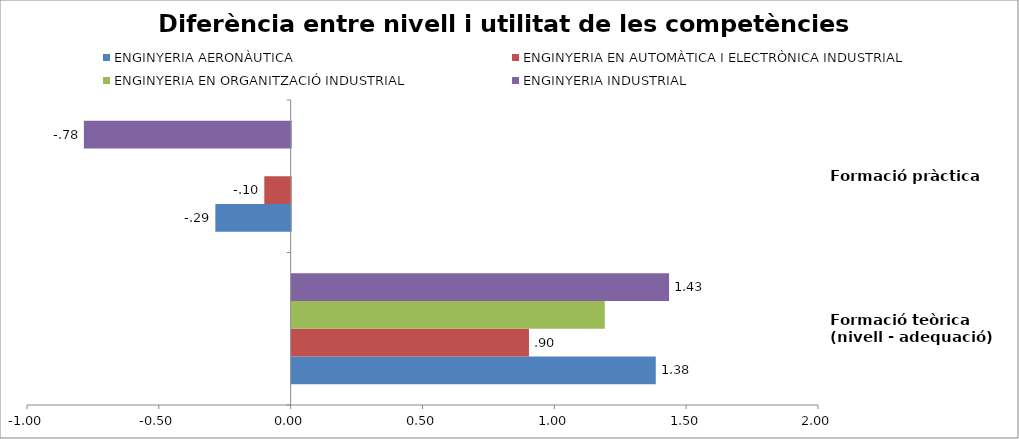
| Category | ENGINYERIA AERONÀUTICA | ENGINYERIA EN AUTOMÀTICA I ELECTRÒNICA INDUSTRIAL | ENGINYERIA EN ORGANITZACIÓ INDUSTRIAL | ENGINYERIA INDUSTRIAL |
|---|---|---|---|---|
| Formació teòrica (nivell - adequació) | 1.381 | 0.9 | 1.187 | 1.431 |
| Formació pràctica | -0.286 | -0.1 | 0 | -0.784 |